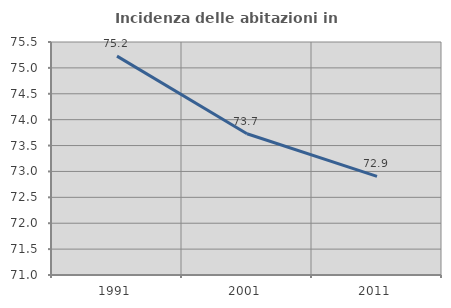
| Category | Incidenza delle abitazioni in proprietà  |
|---|---|
| 1991.0 | 75.227 |
| 2001.0 | 73.729 |
| 2011.0 | 72.904 |